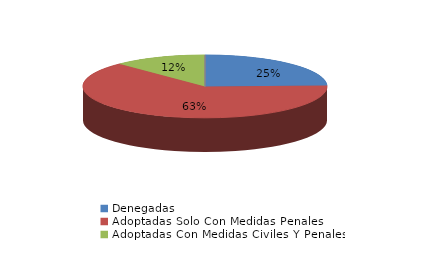
| Category | Series 0 |
|---|---|
| Denegadas | 14 |
| Adoptadas Solo Con Medidas Penales | 36 |
| Adoptadas Con Medidas Civiles Y Penales | 7 |
| Adoptadas Con Medidas Solo Civiles | 0 |